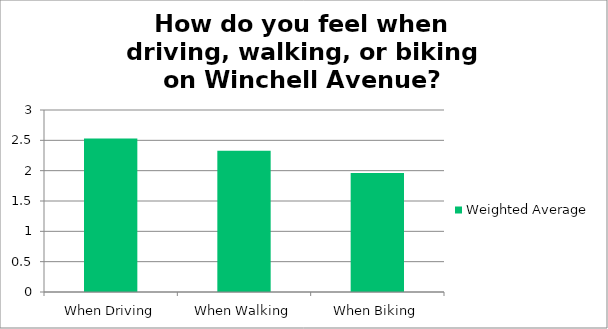
| Category | Weighted Average |
|---|---|
| When Driving | 2.53 |
| When Walking | 2.33 |
| When Biking | 1.96 |